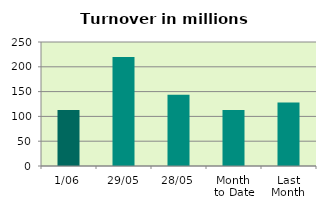
| Category | Series 0 |
|---|---|
| 1/06 | 112.909 |
| 29/05 | 219.758 |
| 28/05 | 143.838 |
| Month 
to Date | 112.909 |
| Last
Month | 127.932 |